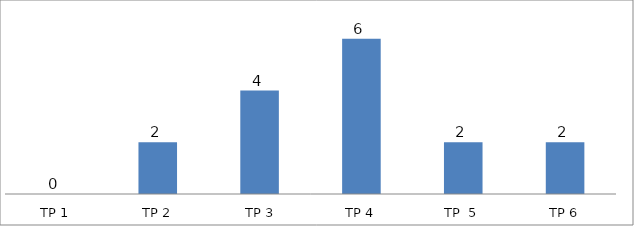
| Category | BIL. MURID |
|---|---|
| TP 1 | 0 |
| TP 2 | 2 |
|  TP 3 | 4 |
| TP 4 | 6 |
| TP  5 | 2 |
| TP 6 | 2 |